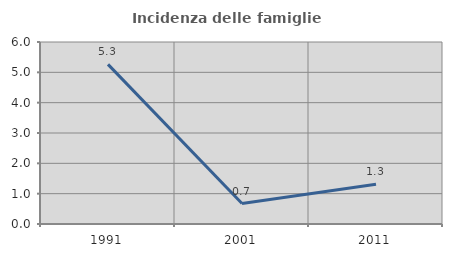
| Category | Incidenza delle famiglie numerose |
|---|---|
| 1991.0 | 5.263 |
| 2001.0 | 0.676 |
| 2011.0 | 1.307 |